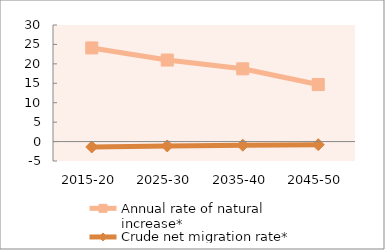
| Category | Annual rate of natural increase* | Crude net migration rate* |
|---|---|---|
| 2015-20 | 24.099 | -1.396 |
| 2025-30 | 20.981 | -1.131 |
| 2035-40 | 18.725 | -0.936 |
| 2045-50 | 14.674 | -0.799 |